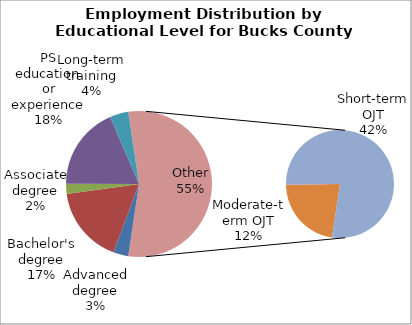
| Category | Series 0 |
|---|---|
| Advanced degree | 9630 |
| Bachelor's degree | 49390 |
| Associate degree | 6430 |
| PS education or experience | 53260 |
| Long-term training | 11800 |
| Moderate-term OJT | 35380 |
| Short-term OJT | 122300 |